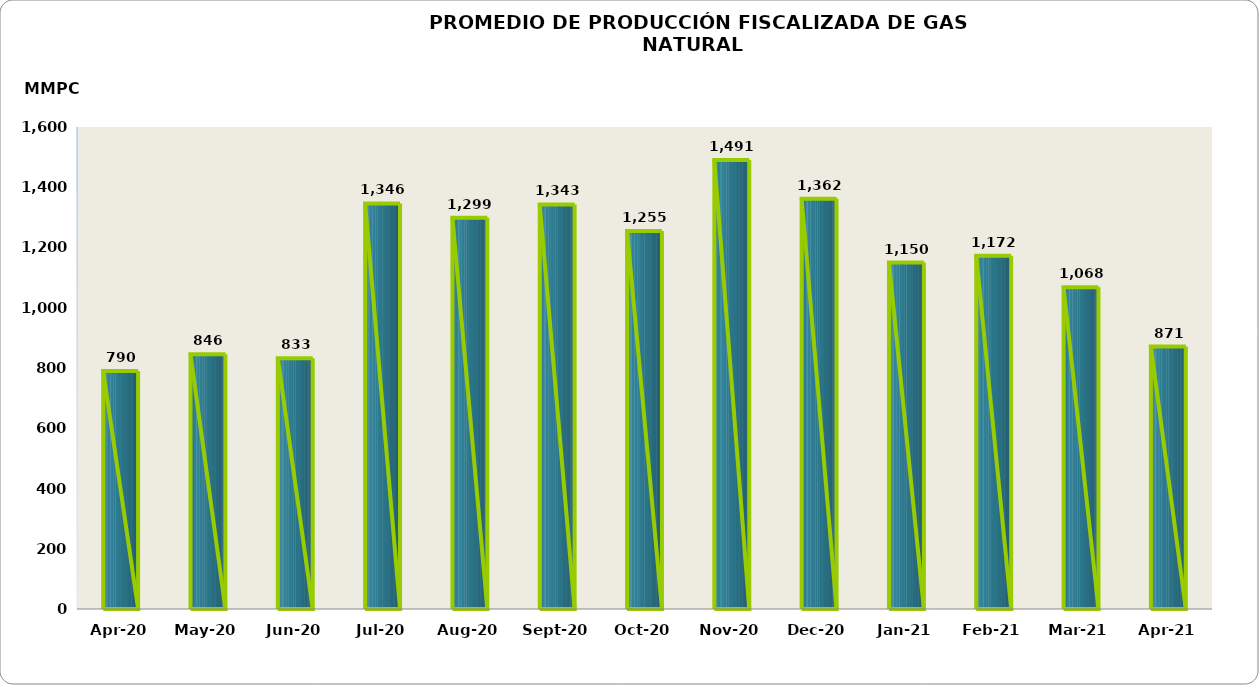
| Category | Series 0 |
|---|---|
| 2020-04-01 | 790178.83 |
| 2020-05-01 | 845915.213 |
| 2020-06-01 | 832774.501 |
| 2020-07-01 | 1346101.494 |
| 2020-08-01 | 1298655.154 |
| 2020-09-01 | 1342976.236 |
| 2020-10-01 | 1254828.351 |
| 2020-11-01 | 1490754.692 |
| 2020-12-01 | 1361515.502 |
| 2021-01-01 | 1150031.71 |
| 2021-02-01 | 1172289.733 |
| 2021-03-01 | 1067744.591 |
| 2021-04-01 | 871274.072 |